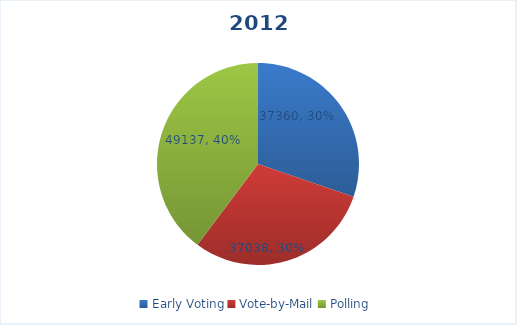
| Category | Series 0 |
|---|---|
| Early Voting | 37360 |
| Vote-by-Mail | 37038 |
| Polling | 49137 |